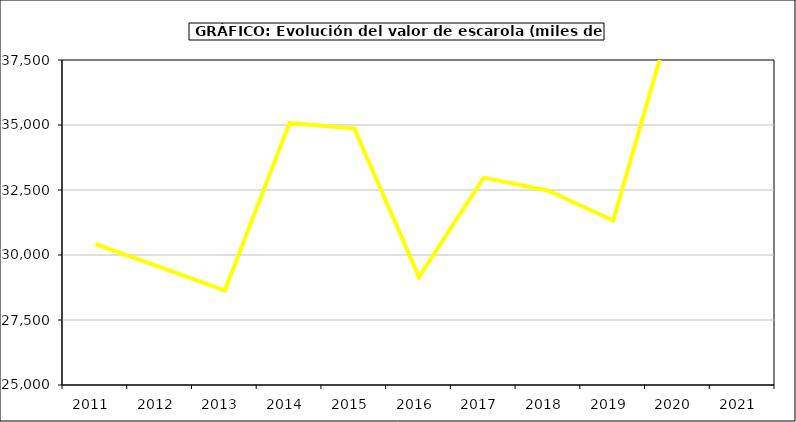
| Category | Valor |
|---|---|
| 2011.0 | 30423.163 |
| 2012.0 | 29537.457 |
| 2013.0 | 28639.256 |
| 2014.0 | 35074.052 |
| 2015.0 | 34867 |
| 2016.0 | 29152 |
| 2017.0 | 32975.446 |
| 2018.0 | 32472.175 |
| 2019.0 | 31324.351 |
| 2020.0 | 39947.279 |
| 2021.0 | 38074.827 |